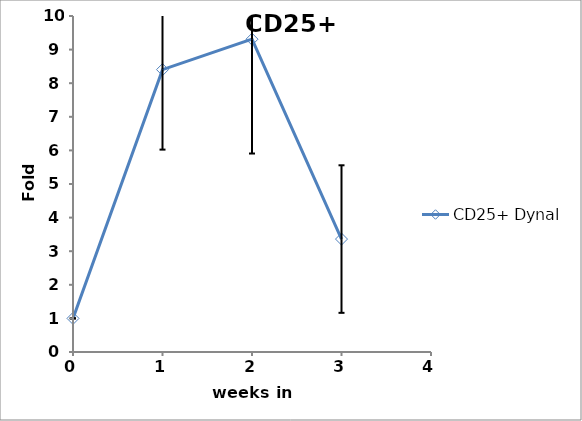
| Category | CD25+ |
|---|---|
| 0.0 | 1 |
| 1.0 | 8.404 |
| 2.0 | 9.31 |
| 3.0 | 3.361 |